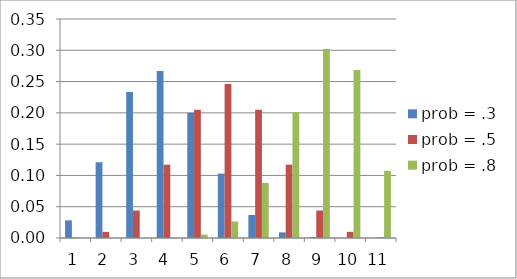
| Category | prob = .3 | prob = .5 | prob = .8 |
|---|---|---|---|
| 0 | 0.028 | 0.001 | 0 |
| 1 | 0.121 | 0.01 | 0 |
| 2 | 0.233 | 0.044 | 0 |
| 3 | 0.267 | 0.117 | 0.001 |
| 4 | 0.2 | 0.205 | 0.006 |
| 5 | 0.103 | 0.246 | 0.026 |
| 6 | 0.037 | 0.205 | 0.088 |
| 7 | 0.009 | 0.117 | 0.201 |
| 8 | 0.001 | 0.044 | 0.302 |
| 9 | 0 | 0.01 | 0.268 |
| 10 | 0 | 0.001 | 0.107 |